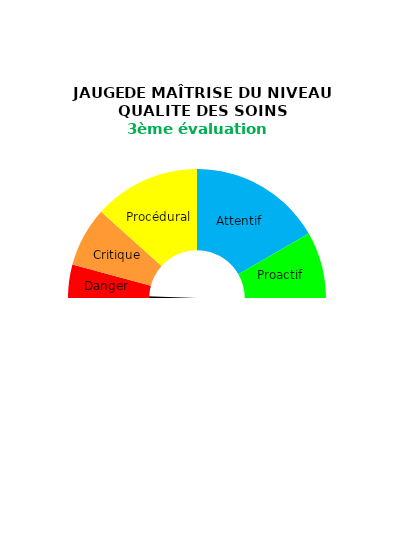
| Category | aiguille |
|---|---|
| 0 | 0 |
| 1 | 2 |
| 2 | 358 |